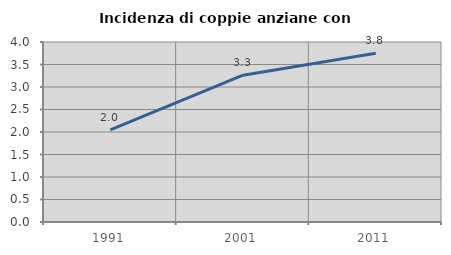
| Category | Incidenza di coppie anziane con figli |
|---|---|
| 1991.0 | 2.046 |
| 2001.0 | 3.263 |
| 2011.0 | 3.75 |